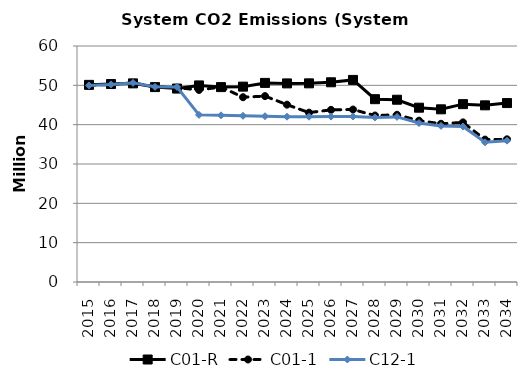
| Category | C01-R | C01-1 | C12-1 |
|---|---|---|---|
| 2015.0 | 50.118 | 49.98 | 49.98 |
| 2016.0 | 50.329 | 50.239 | 50.238 |
| 2017.0 | 50.499 | 50.623 | 50.623 |
| 2018.0 | 49.555 | 49.637 | 49.62 |
| 2019.0 | 49.181 | 49.422 | 49.588 |
| 2020.0 | 49.976 | 48.827 | 42.494 |
| 2021.0 | 49.548 | 49.578 | 42.376 |
| 2022.0 | 49.671 | 46.971 | 42.259 |
| 2023.0 | 50.618 | 47.262 | 42.141 |
| 2024.0 | 50.491 | 45.086 | 42.024 |
| 2025.0 | 50.508 | 43.063 | 42.024 |
| 2026.0 | 50.777 | 43.764 | 42.053 |
| 2027.0 | 51.38 | 43.847 | 42.083 |
| 2028.0 | 46.481 | 42.329 | 41.836 |
| 2029.0 | 46.342 | 42.511 | 41.972 |
| 2030.0 | 44.317 | 41.021 | 40.416 |
| 2031.0 | 43.901 | 40.228 | 39.69 |
| 2032.0 | 45.215 | 40.585 | 39.528 |
| 2033.0 | 44.915 | 36.207 | 35.517 |
| 2034.0 | 45.496 | 36.272 | 35.937 |